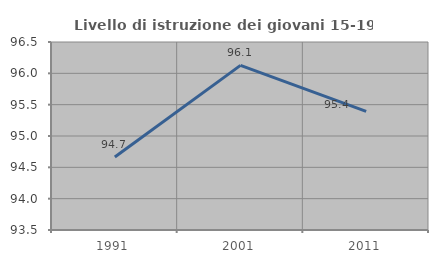
| Category | Livello di istruzione dei giovani 15-19 anni |
|---|---|
| 1991.0 | 94.664 |
| 2001.0 | 96.128 |
| 2011.0 | 95.392 |